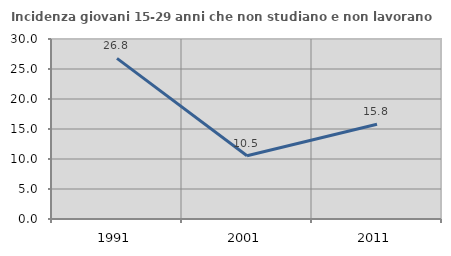
| Category | Incidenza giovani 15-29 anni che non studiano e non lavorano  |
|---|---|
| 1991.0 | 26.763 |
| 2001.0 | 10.532 |
| 2011.0 | 15.804 |